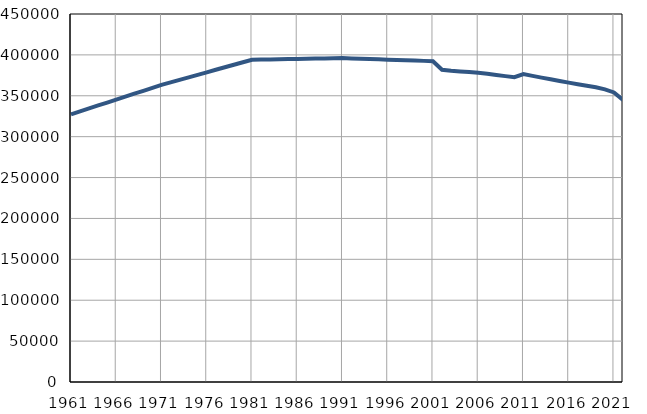
| Category | Број
становника |
|---|---|
| 1961.0 | 327367 |
| 1962.0 | 330960 |
| 1963.0 | 334552 |
| 1964.0 | 338145 |
| 1965.0 | 341737 |
| 1966.0 | 345330 |
| 1967.0 | 348922 |
| 1968.0 | 352515 |
| 1969.0 | 356107 |
| 1970.0 | 359700 |
| 1971.0 | 363292 |
| 1972.0 | 366374 |
| 1973.0 | 369456 |
| 1974.0 | 372537 |
| 1975.0 | 375619 |
| 1976.0 | 378701 |
| 1977.0 | 381783 |
| 1978.0 | 384865 |
| 1979.0 | 387946 |
| 1980.0 | 391028 |
| 1981.0 | 394110 |
| 1982.0 | 394303 |
| 1983.0 | 394497 |
| 1984.0 | 394690 |
| 1985.0 | 394883 |
| 1986.0 | 395077 |
| 1987.0 | 395270 |
| 1988.0 | 395463 |
| 1989.0 | 395656 |
| 1990.0 | 395850 |
| 1991.0 | 396043 |
| 1992.0 | 395669 |
| 1993.0 | 395296 |
| 1994.0 | 394922 |
| 1995.0 | 394548 |
| 1996.0 | 394174 |
| 1997.0 | 393801 |
| 1998.0 | 393427 |
| 1999.0 | 393053 |
| 2000.0 | 392679 |
| 2001.0 | 392306 |
| 2002.0 | 381801 |
| 2003.0 | 380579 |
| 2004.0 | 379829 |
| 2005.0 | 379076 |
| 2006.0 | 378059 |
| 2007.0 | 376946 |
| 2008.0 | 375453 |
| 2009.0 | 374017 |
| 2010.0 | 372670 |
| 2011.0 | 376522 |
| 2012.0 | 374371 |
| 2013.0 | 372220 |
| 2014.0 | 370215 |
| 2015.0 | 368088 |
| 2016.0 | 366056 |
| 2017.0 | 364157 |
| 2018.0 | 362331 |
| 2019.0 | 360494 |
| 2020.0 | 357920 |
| 2021.0 | 354102 |
| 2022.0 | 344877 |